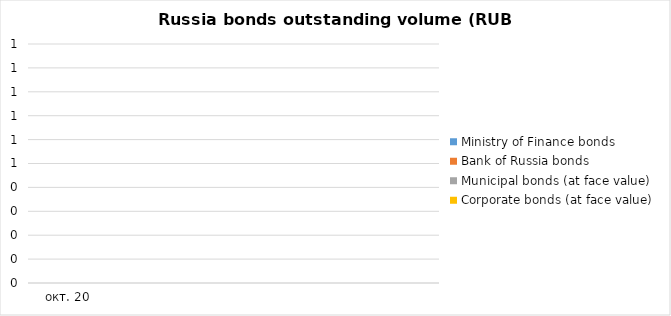
| Category | Ministry of Finance bonds | Bank of Russia bonds | Municipal bonds (at face value) | Corporate bonds (at face value) |
|---|---|---|---|---|
| 2020-10-31 | 0 | 0 | 0 | 0 |
| 2020-11-30 | 0 | 0 | 0 | 0 |
| 2020-11-30 | 0 | 0 | 0 | 0 |
| 2020-12-31 | 0 | 0 | 0 | 0 |
| 2021-01-31 | 0 | 0 | 0 | 0 |
| 2021-02-28 | 0 | 0 | 0 | 0 |